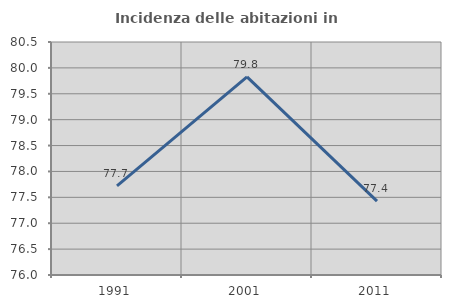
| Category | Incidenza delle abitazioni in proprietà  |
|---|---|
| 1991.0 | 77.722 |
| 2001.0 | 79.827 |
| 2011.0 | 77.428 |